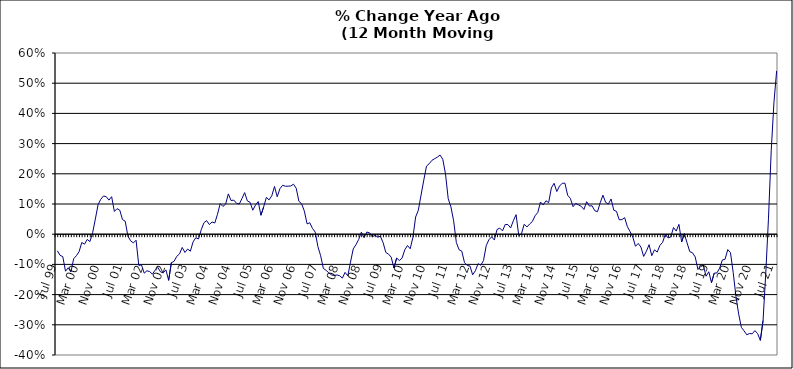
| Category | Series 0 |
|---|---|
| Jul 99 | -0.055 |
| Aug 99 | -0.07 |
| Sep 99 | -0.074 |
| Oct 99 | -0.123 |
| Nov 99 | -0.111 |
| Dec 99 | -0.125 |
| Jan 00 | -0.082 |
| Feb 00 | -0.071 |
| Mar 00 | -0.058 |
| Apr 00 | -0.027 |
| May 00 | -0.033 |
| Jun 00 | -0.017 |
| Jul 00 | -0.025 |
| Aug 00 | 0.005 |
| Sep 00 | 0.05 |
| Oct 00 | 0.098 |
| Nov 00 | 0.116 |
| Dec 00 | 0.127 |
| Jan 01 | 0.124 |
| Feb 01 | 0.113 |
| Mar 01 | 0.124 |
| Apr 01 | 0.075 |
| May 01 | 0.085 |
| Jun 01 | 0.08 |
| Jul 01 | 0.048 |
| Aug 01 | 0.043 |
| Sep 01 | -0.007 |
| Oct 01 | -0.022 |
| Nov 01 | -0.029 |
| Dec 01 | -0.02 |
| Jan 02 | -0.103 |
| Feb 02 | -0.102 |
| Mar 02 | -0.129 |
| Apr 02 | -0.121 |
| May 02 | -0.124 |
| Jun 02 | -0.132 |
| Jul 02 | -0.119 |
| Aug 02 | -0.11 |
| Sep 02 | -0.125 |
| Oct 02 | -0.128 |
| Nov 02 | -0.118 |
| Dec 02 | -0.153 |
| Jan 03 | -0.094 |
| Feb 03 | -0.09 |
| Mar 03 | -0.073 |
| Apr 03 | -0.065 |
| May 03 | -0.044 |
| Jun 03 | -0.06 |
| Jul 03 | -0.049 |
| Aug 03 | -0.056 |
| Sep 03 | -0.026 |
| Oct 03 | -0.012 |
| Nov 03 | -0.016 |
| Dec 03 | 0.014 |
| Jan 04 | 0.038 |
| Feb 04 | 0.045 |
| Mar 04 | 0.032 |
| Apr 04 | 0.041 |
| May 04 | 0.037 |
| Jun 04 | 0.066 |
| Jul 04 | 0.101 |
| Aug 04 | 0.092 |
| Sep 04 | 0.1 |
| Oct 04 | 0.133 |
| Nov 04 | 0.111 |
| Dec 04 | 0.113 |
| Jan 05 | 0.103 |
| Feb 05 | 0.1 |
| Mar 05 | 0.118 |
| Apr 05 | 0.138 |
| May 05 | 0.11 |
| Jun 05 | 0.106 |
| Jul 05 | 0.079 |
| Aug 05 | 0.097 |
| Sep 05 | 0.108 |
| Oct 05 | 0.063 |
| Nov 05 | 0.09 |
| Dec 05 | 0.122 |
| Jan 06 | 0.114 |
| Feb 06 | 0.127 |
| Mar 06 | 0.158 |
| Apr 06 | 0.124 |
| May 06 | 0.151 |
| Jun 06 | 0.162 |
| Jul 06 | 0.159 |
| Aug 06 | 0.159 |
| Sep 06 | 0.16 |
| Oct 06 | 0.166 |
| Nov 06 | 0.152 |
| Dec 06 | 0.109 |
| Jan 07 | 0.101 |
| Feb 07 | 0.076 |
| Mar 07 | 0.034 |
| Apr 07 | 0.038 |
| May 07 | 0.019 |
| Jun 07 | 0.007 |
| Jul 07 | -0.041 |
| Aug 07 | -0.071 |
| Sep 07 | -0.113 |
| Oct 07 | -0.12 |
| Nov 07 | -0.128 |
| Dec 07 | -0.135 |
| Jan 08 | -0.137 |
| Feb 08 | -0.135 |
| Mar 08 | -0.137 |
| Apr 08 | -0.145 |
| May 08 | -0.126 |
| Jun 08 | -0.138 |
| Jul 08 | -0.093 |
| Aug 08 | -0.049 |
| Sep-08 | -0.035 |
| Oct 08 | -0.018 |
| Nov 08 | 0.007 |
| Dec 08 | -0.011 |
| Jan 09 | 0.007 |
| Feb 09 | 0.005 |
| Mar 09 | -0.009 |
| Apr 09 | -0.003 |
| May 09 | -0.01 |
| Jun 09 | -0.007 |
| Jul 09 | -0.027 |
| Aug 09 | -0.06 |
| Sep 09 | -0.066 |
| Oct 09 | -0.076 |
| Nov 09 | -0.112 |
| Dec 09 | -0.079 |
| Jan 10 | -0.087 |
| Feb 10 | -0.079 |
| Mar 10 | -0.052 |
| Apr 10 | -0.037 |
| May 10 | -0.048 |
| Jun 10 | -0.01 |
| Jul 10 | 0.057 |
| Aug 10 | 0.08 |
| Sep 10 | 0.13 |
| Oct 10 | 0.179 |
| Nov 10 | 0.226 |
| Dec 10 | 0.233 |
| Jan 11 | 0.245 |
| Feb 11 | 0.25 |
| Mar 11 | 0.255 |
| Apr 11 | 0.262 |
| May 11 | 0.248 |
| Jun 11 | 0.199 |
| Jul 11 | 0.118 |
| Aug 11 | 0.09 |
| Sep 11 | 0.044 |
| Oct 11 | -0.028 |
| Nov 11 | -0.051 |
| Dec 11 | -0.056 |
| Jan 12 | -0.094 |
| Feb 12 | -0.104 |
| Mar 12 | -0.105 |
| Apr 12 | -0.134 |
| May 12 | -0.121 |
| Jun 12 | -0.098 |
| Jul 12 | -0.103 |
| Aug 12 | -0.087 |
| Sep 12 | -0.038 |
| Oct 12 | -0.018 |
| Nov 12 | -0.009 |
| Dec 12 | -0.019 |
| Jan 13 | 0.016 |
| Feb-13 | 0.02 |
| Mar-13 | 0.011 |
| Apr 13 | 0.032 |
| May 13 | 0.032 |
| Jun-13 | 0.021 |
| Jul 13 | 0.045 |
| Aug 13 | 0.065 |
| Sep 13 | -0.005 |
| Oct 13 | 0.002 |
| Nov 13 | 0.033 |
| Dec 13 | 0.024 |
| Jan 14 | 0.034 |
| Feb-14 | 0.042 |
| Mar 14 | 0.061 |
| Apr 14 | 0.072 |
| May 14 | 0.107 |
| Jun 14 | 0.097 |
| Jul-14 | 0.111 |
| Aug-14 | 0.105 |
| Sep 14 | 0.153 |
| Oct 14 | 0.169 |
| Nov 14 | 0.141 |
| Dec 14 | 0.159 |
| Jan 15 | 0.169 |
| Feb 15 | 0.169 |
| Mar 15 | 0.129 |
| Apr-15 | 0.118 |
| May 15 | 0.091 |
| Jun-15 | 0.102 |
| Jul 15 | 0.097 |
| Aug 15 | 0.092 |
| Sep 15 | 0.082 |
| Oct 15 | 0.108 |
| Nov 15 | 0.093 |
| Dec 15 | 0.094 |
| Jan 16 | 0.078 |
| Feb 16 | 0.075 |
| Mar 16 | 0.104 |
| Apr 16 | 0.129 |
| May 16 | 0.105 |
| Jun 16 | 0.1 |
| Jul 16 | 0.117 |
| Aug 16 | 0.08 |
| Sep 16 | 0.076 |
| Oct 16 | 0.048 |
| Nov 16 | 0.048 |
| Dec 16 | 0.055 |
| Jan 17 | 0.025 |
| Feb 17 | 0.009 |
| Mar 17 | -0.01 |
| Apr 17 | -0.04 |
| May 17 | -0.031 |
| Jun 17 | -0.042 |
| Jul 17 | -0.074 |
| Aug 17 | -0.057 |
| Sep 17 | -0.035 |
| Oct 17 | -0.071 |
| Nov 17 | -0.052 |
| Dec 17 | -0.059 |
| Jan 18 | -0.037 |
| Feb 18 | -0.027 |
| Mar 18 | 0 |
| Apr 18 | -0.012 |
| May 18 | -0.009 |
| Jun 18 | 0.022 |
| Jul 18 | 0.01 |
| Aug 18 | 0.033 |
| Sep 18 | -0.025 |
| Oct 18 | 0.002 |
| Nov 18 | -0.029 |
| Dec 18 | -0.058 |
| Jan 19 | -0.061 |
| Feb 19 | -0.075 |
| Mar 19 | -0.117 |
| Apr 19 | -0.107 |
| May 19 | -0.104 |
| Jun 19 | -0.139 |
| Jul 19 | -0.124 |
| Aug 19 | -0.16 |
| Sep 19 | -0.129 |
| Oct 19 | -0.128 |
| Nov 19 | -0.112 |
| Dec 19 | -0.085 |
| Jan 20 | -0.083 |
| Feb 20 | -0.051 |
| Mar 20 | -0.061 |
| Apr 20 | -0.127 |
| May 20 | -0.206 |
| Jun 20 | -0.264 |
| Jul 20 | -0.308 |
| Aug 20 | -0.32 |
| Sep 20 | -0.333 |
| Oct 20 | -0.329 |
| Nov 20 | -0.33 |
| Dec 20 | -0.319 |
| Jan 21 | -0.329 |
| Feb 21 | -0.352 |
| Mar 21 | -0.286 |
| Apr 21 | -0.129 |
| May 21 | 0.053 |
| Jun 21 | 0.276 |
| Jul 21 | 0.435 |
| Aug 21 | 0.541 |